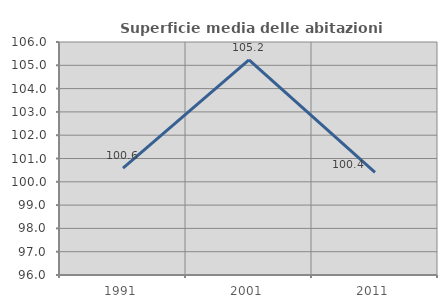
| Category | Superficie media delle abitazioni occupate |
|---|---|
| 1991.0 | 100.586 |
| 2001.0 | 105.232 |
| 2011.0 | 100.401 |